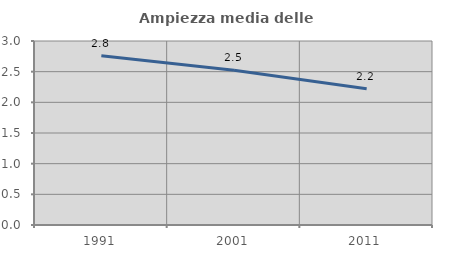
| Category | Ampiezza media delle famiglie |
|---|---|
| 1991.0 | 2.758 |
| 2001.0 | 2.523 |
| 2011.0 | 2.221 |